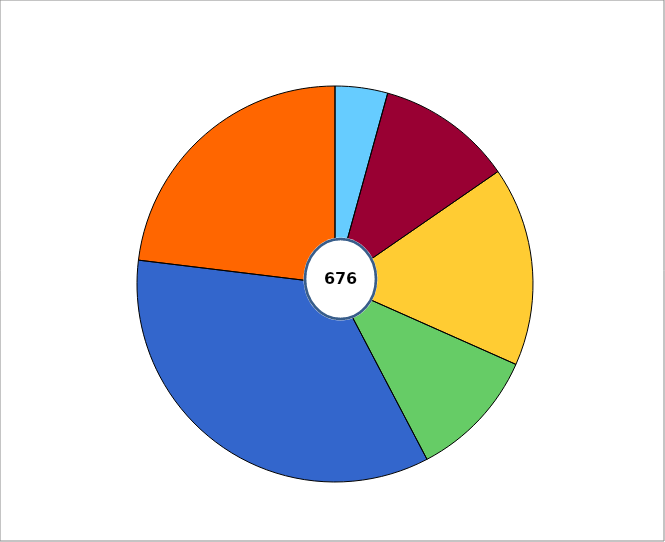
| Category | Series 1 |
|---|---|
| 0 | 29 |
| 1 | 75 |
| 2 | 110 |
| 3 | 72 |
| 4 | 234 |
| 5 | 156 |